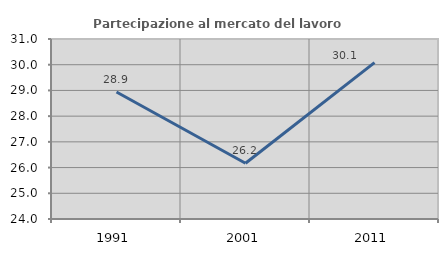
| Category | Partecipazione al mercato del lavoro  femminile |
|---|---|
| 1991.0 | 28.941 |
| 2001.0 | 26.169 |
| 2011.0 | 30.081 |